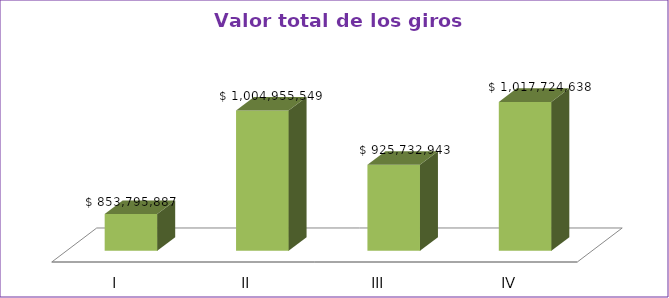
| Category | Series 0 |
|---|---|
| I | 853795887 |
| II | 1004955549 |
| III | 925732943 |
| IV | 1017724638 |